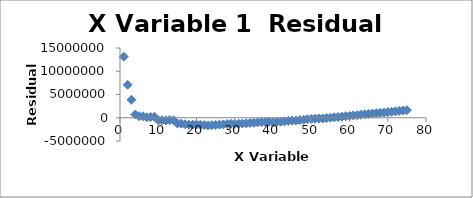
| Category | Series 0 |
|---|---|
| 1.0 | 13127291.194 |
| 2.0 | 7085700.389 |
| 3.0 | 3874915.585 |
| 4.0 | 697696.78 |
| 5.0 | 328560.975 |
| 6.0 | 310632.17 |
| 7.0 | 89660.365 |
| 8.0 | 143572.56 |
| 9.0 | 217816.755 |
| 10.0 | -525056.05 |
| 11.0 | -530404.855 |
| 12.0 | -581216.659 |
| 13.0 | -496185.464 |
| 14.0 | -562446.269 |
| 15.0 | -1241105.074 |
| 16.0 | -1263640.879 |
| 17.0 | -1400047.684 |
| 18.0 | -1492010.489 |
| 19.0 | -1482560.294 |
| 20.0 | -1456805.099 |
| 21.0 | -1524896.903 |
| 22.0 | -1587931.708 |
| 23.0 | -1639262.513 |
| 24.0 | -1599188.318 |
| 25.0 | -1552094.123 |
| 26.0 | -1481235.928 |
| 27.0 | -1422553.733 |
| 28.0 | -1353283.538 |
| 29.0 | -1290282.343 |
| 30.0 | -1334184.148 |
| 31.0 | -1288332.952 |
| 32.0 | -1242011.757 |
| 33.0 | -1207273.562 |
| 34.0 | -1128534.367 |
| 35.0 | -1079642.172 |
| 36.0 | -992932.977 |
| 37.0 | -952524.782 |
| 38.0 | -910003.587 |
| 39.0 | -819029.392 |
| 40.0 | -962710.196 |
| 41.0 | -897807.001 |
| 42.0 | -846443.806 |
| 43.0 | -773114.611 |
| 44.0 | -700199.416 |
| 45.0 | -623430.221 |
| 46.0 | -587514.026 |
| 47.0 | -504834.831 |
| 48.0 | -419136.636 |
| 49.0 | -328653.44 |
| 50.0 | -263181.245 |
| 51.0 | -225457.05 |
| 52.0 | -155129.855 |
| 53.0 | -158669.66 |
| 54.0 | -73196.465 |
| 55.0 | 15083.73 |
| 56.0 | 97478.925 |
| 57.0 | 148767.12 |
| 58.0 | 233348.315 |
| 59.0 | 325559.511 |
| 60.0 | 409970.706 |
| 61.0 | 500988.901 |
| 62.0 | 565054.096 |
| 63.0 | 649701.291 |
| 64.0 | 739382.486 |
| 65.0 | 815393.681 |
| 66.0 | 903182.876 |
| 67.0 | 988877.071 |
| 68.0 | 1045908.267 |
| 69.0 | 1119668.462 |
| 70.0 | 1206551.657 |
| 71.0 | 1287792.852 |
| 72.0 | 1379333.047 |
| 73.0 | 1460416.242 |
| 74.0 | 1548291.437 |
| 75.0 | 1639558.632 |